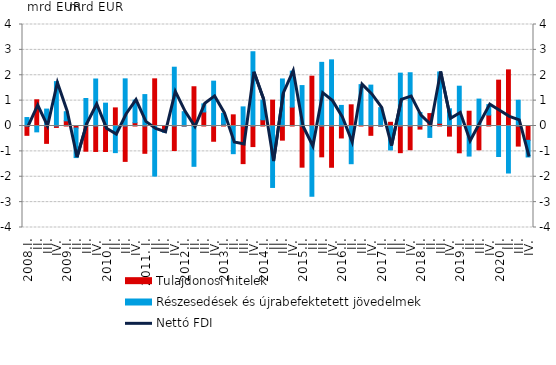
| Category | Tulajdonosi hitelek | Részesedések és újrabefektetett jövedelmek |
|---|---|---|
| 2008.I. | -0.368 | 0.334 |
| II. | 1.034 | -0.231 |
| III. | -0.685 | 0.667 |
| IV. | -0.056 | 1.75 |
| 2009.I. | 0.204 | 0.359 |
| II. | -0.082 | -1.163 |
| III. | -0.994 | 1.084 |
| IV. | -1.003 | 1.852 |
| 2010.I. | -1.006 | 0.9 |
| II. | 0.714 | -1.049 |
| III. | -1.395 | 1.858 |
| IV. | 0.13 | 0.893 |
| 2011. I. | -1.076 | 1.238 |
| II. | 1.858 | -1.975 |
| III. | -0.199 | -0.045 |
| IV. | -0.968 | 2.317 |
| 2012.I. | -0.004 | 0.564 |
| II. | 1.547 | -1.589 |
| III. | 0.553 | 0.32 |
| IV. | -0.601 | 1.767 |
| 2013.I. | 0.068 | 0.429 |
| II. | 0.44 | -1.091 |
| III. | -1.483 | 0.753 |
| IV. | -0.811 | 2.927 |
| 2014.I. | 0.246 | 0.777 |
| II. | 1.019 | -2.421 |
| III. | -0.558 | 1.854 |
| IV. | 0.746 | 1.416 |
| 2015.I. | -1.622 | 1.593 |
| II. | 1.963 | -2.769 |
| III. | -1.215 | 2.509 |
| IV. | -1.626 | 2.607 |
| 2016.I. | -0.471 | 0.811 |
| II. | 0.835 | -1.486 |
| III. | 0.022 | 1.608 |
| IV. | -0.367 | 1.611 |
| 2017.I. | -0.008 | 0.724 |
| II. | 0.146 | -0.943 |
| III. | -1.051 | 2.083 |
| IV. | -0.935 | 2.099 |
| 2018.I. | -0.122 | 0.53 |
| II. | 0.489 | -0.45 |
| III. | 0.109 | 2.021 |
| IV. | -0.399 | 0.68 |
| 2019.I. | -1.056 | 1.569 |
| II. | 0.583 | -1.186 |
| III. | -0.939 | 1.061 |
| IV. | 0.432 | 0.41 |
| 2020.I. | 1.807 | -1.203 |
| II. | 2.212 | -1.853 |
| III. | -0.792 | 1.016 |
| IV. | -0.565 | -0.656 |